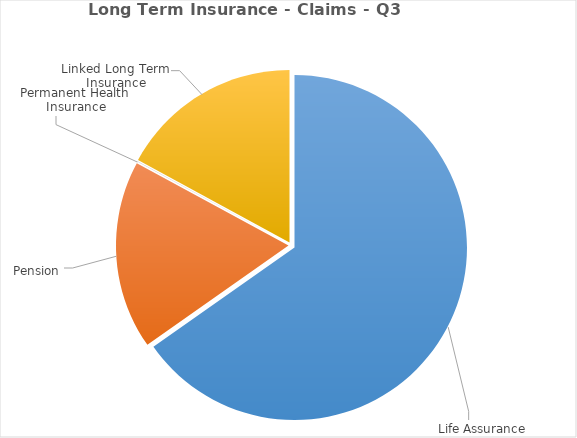
| Category | Series 0 |
|---|---|
| Life Assurance | 1296209846.8 |
| Pension | 350715659 |
| Permanent Health Insurance | 709705 |
| Linked Long Term Insurance | 339057189 |